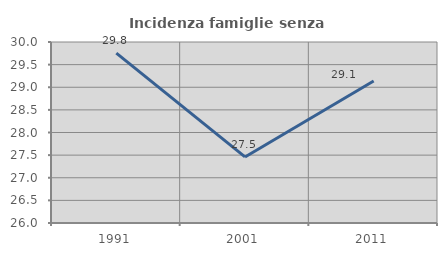
| Category | Incidenza famiglie senza nuclei |
|---|---|
| 1991.0 | 29.754 |
| 2001.0 | 27.46 |
| 2011.0 | 29.138 |